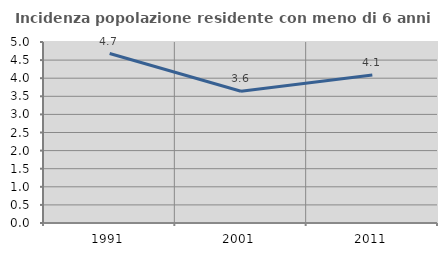
| Category | Incidenza popolazione residente con meno di 6 anni |
|---|---|
| 1991.0 | 4.682 |
| 2001.0 | 3.638 |
| 2011.0 | 4.09 |